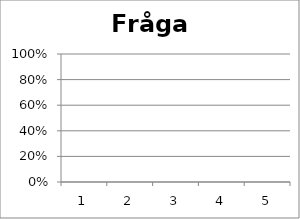
| Category | Fråga 3 |
|---|---|
| 0 | 0 |
| 1 | 0 |
| 2 | 0 |
| 3 | 0 |
| 4 | 0 |